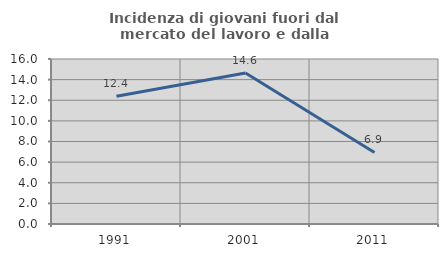
| Category | Incidenza di giovani fuori dal mercato del lavoro e dalla formazione  |
|---|---|
| 1991.0 | 12.389 |
| 2001.0 | 14.634 |
| 2011.0 | 6.936 |